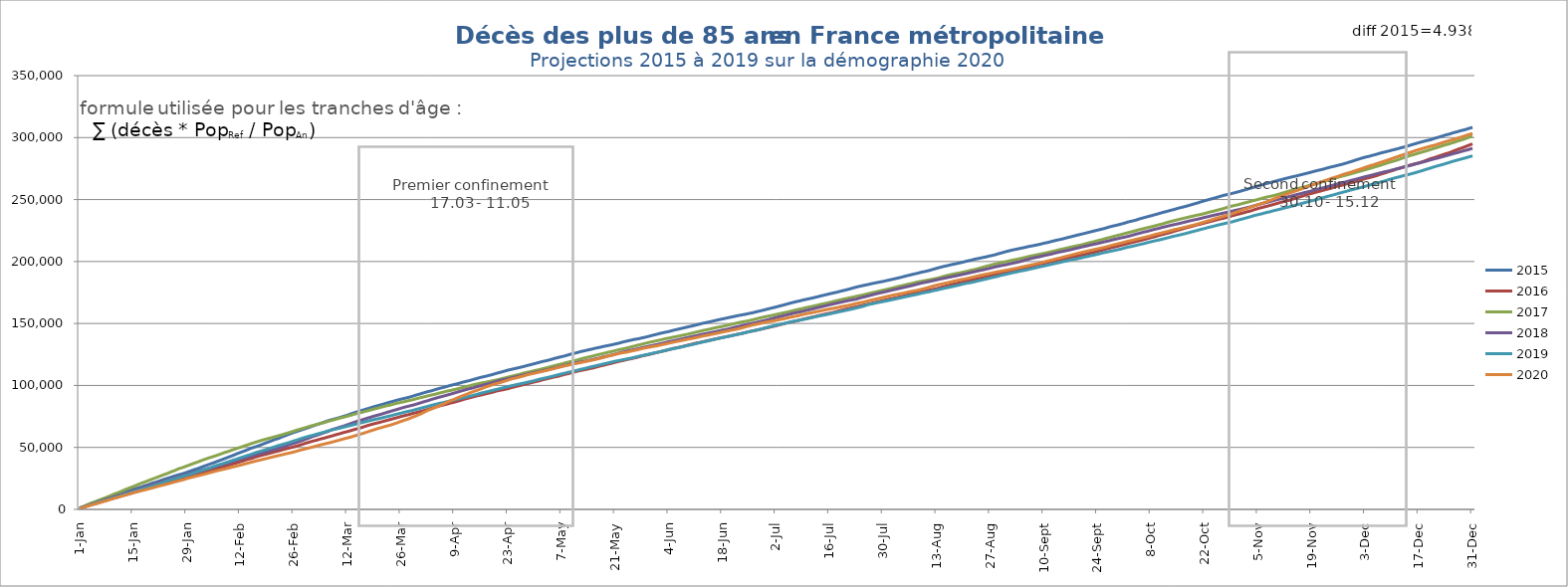
| Category | 2015 | 2016 | 2017 | 2018 | 2019 | 2020 |
|---|---|---|---|---|---|---|
| 2021-01-01 | 1002 | 965 | 1224 | 1048 | 890 | 849 |
| 2021-01-02 | 1899 | 1851 | 2394 | 1962 | 1838 | 1591 |
| 2021-01-03 | 3113 | 2844 | 3743 | 2912 | 2767 | 2603 |
| 2021-01-04 | 4269 | 3743 | 5067 | 3973 | 3746 | 3519 |
| 2021-01-05 | 5322 | 4517 | 6142 | 4996 | 4707 | 4286 |
| 2021-01-06 | 6073 | 5397 | 7405 | 6106 | 5683 | 5136 |
| 2021-01-07 | 7222 | 6390 | 8526 | 7141 | 6641 | 6212 |
| 2021-01-08 | 8402 | 7294 | 9686 | 8321 | 7670 | 7034 |
| 2021-01-09 | 9370 | 8201 | 10924 | 9208 | 8559 | 8070 |
| 2021-01-10 | 10559 | 9103 | 12335 | 10106 | 9480 | 8967 |
| 2021-01-11 | 11648 | 9971 | 13406 | 11138 | 10251 | 9740 |
| 2021-01-12 | 12802 | 10944 | 14687 | 12062 | 11454 | 10680 |
| 2021-01-13 | 13999 | 11868 | 16066 | 13105 | 12411 | 11549 |
| 2021-01-14 | 15185 | 12590 | 17241 | 14133 | 13339 | 12439 |
| 2021-01-15 | 16182 | 13504 | 18389 | 15092 | 14265 | 13373 |
| 2021-01-16 | 17082 | 14327 | 19683 | 16084 | 15225 | 14223 |
| 2021-01-17 | 17948 | 15369 | 20966 | 17078 | 16167 | 14981 |
| 2021-01-18 | 19030 | 16241 | 22040 | 18123 | 17090 | 15723 |
| 2021-01-19 | 19984 | 17296 | 23263 | 19224 | 18090 | 16532 |
| 2021-01-20 | 21166 | 18204 | 24435 | 20231 | 18948 | 17302 |
| 2021-01-21 | 22003 | 19092 | 25610 | 21212 | 19977 | 18175 |
| 2021-01-22 | 23093 | 19808 | 26796 | 22165 | 20862 | 19026 |
| 2021-01-23 | 24162 | 20660 | 27994 | 23002 | 22056 | 19792 |
| 2021-01-24 | 25133 | 21499 | 29073 | 23772 | 23160 | 20568 |
| 2021-01-25 | 26090 | 22455 | 30377 | 24684 | 23998 | 21410 |
| 2021-01-26 | 27133 | 23147 | 31522 | 25636 | 24922 | 22265 |
| 2021-01-27 | 28009 | 23848 | 32953 | 26551 | 25825 | 23108 |
| 2021-01-28 | 28869 | 24608 | 33825 | 27391 | 26743 | 23845 |
| 2021-01-29 | 29902 | 25662 | 35010 | 28263 | 27579 | 24864 |
| 2021-01-30 | 30985 | 26572 | 36158 | 29159 | 28529 | 25631 |
| 2021-01-31 | 32116 | 27528 | 37297 | 30061 | 29486 | 26453 |
| 2021-02-01 | 33040 | 28407 | 38370 | 30873 | 30574 | 27186 |
| 2021-02-02 | 34274 | 29356 | 39592 | 31637 | 31449 | 27970 |
| 2021-02-03 | 35372 | 30272 | 40713 | 32468 | 32411 | 28737 |
| 2021-02-04 | 36485 | 31154 | 41722 | 33332 | 33298 | 29594 |
| 2021-02-05 | 37547 | 32089 | 42715 | 34105 | 34580 | 30394 |
| 2021-02-06 | 38757 | 33018 | 43716 | 34992 | 35657 | 31243 |
| 2021-02-07 | 39905 | 34010 | 44867 | 35956 | 36529 | 31959 |
| 2021-02-08 | 41046 | 34845 | 45973 | 36827 | 37581 | 32638 |
| 2021-02-09 | 42283 | 35794 | 46891 | 37707 | 38546 | 33368 |
| 2021-02-10 | 43404 | 36658 | 48070 | 38756 | 39600 | 34230 |
| 2021-02-11 | 44762 | 37553 | 49079 | 39674 | 40590 | 34943 |
| 2021-02-12 | 45933 | 38453 | 50052 | 40545 | 41614 | 35715 |
| 2021-02-13 | 47064 | 39395 | 51105 | 41448 | 42624 | 36530 |
| 2021-02-14 | 48273 | 40436 | 52141 | 42328 | 43632 | 37370 |
| 2021-02-15 | 49558 | 41161 | 53251 | 43175 | 44640 | 38212 |
| 2021-02-16 | 50500 | 42227 | 54188 | 44111 | 45768 | 38959 |
| 2021-02-17 | 51536 | 43187 | 55197 | 44932 | 46670 | 39715 |
| 2021-02-18 | 52816 | 43986 | 56107 | 45659 | 47571 | 40470 |
| 2021-02-19 | 54000 | 44747 | 56937 | 46652 | 48626 | 41207 |
| 2021-02-20 | 55141 | 45548 | 57720 | 47533 | 49599 | 42006 |
| 2021-02-21 | 56370 | 46434 | 58594 | 48422 | 50497 | 42732 |
| 2021-02-22 | 57271 | 47148 | 59438 | 49319 | 51549 | 43461 |
| 2021-02-23 | 58617 | 48072 | 60318 | 50331 | 52382 | 44153 |
| 2021-02-24 | 59792 | 48938 | 61275 | 51254 | 53260 | 44952 |
| 2021-02-25 | 61022 | 49687 | 62202 | 52408 | 54202 | 45569 |
| 2021-02-26 | 62131 | 50467 | 63169 | 53320 | 55265 | 46325 |
| 2021-02-27 | 63097 | 51331 | 64193 | 54306 | 56186 | 47259 |
| 2021-02-28 | 64169 | 52306 | 65054 | 55353 | 57264 | 48105 |
| 2021-03-01 | 65164 | 53320 | 65942 | 56541 | 58228 | 48827 |
| 2021-03-02 | 66217 | 54283 | 66904 | 57698 | 59091 | 49681 |
| 2021-03-03 | 67354 | 55147 | 67788 | 58898 | 59861 | 50394 |
| 2021-03-04 | 68443 | 55893 | 68538 | 59816 | 60767 | 51241 |
| 2021-03-05 | 69392 | 56856 | 69393 | 60913 | 61579 | 52099 |
| 2021-03-06 | 70532 | 57572 | 70128 | 62010 | 62445 | 52828 |
| 2021-03-07 | 71627 | 58491 | 71124 | 62982 | 63414 | 53546 |
| 2021-03-08 | 72464 | 59314 | 71895 | 64416 | 64186 | 54296 |
| 2021-03-09 | 73280 | 60268 | 72799 | 65332 | 64856 | 55187 |
| 2021-03-10 | 74167 | 61095 | 73686 | 66309 | 65585 | 55972 |
| 2021-03-11 | 75106 | 62031 | 74433 | 67208 | 66361 | 56886 |
| 2021-03-12 | 76022 | 62793 | 75222 | 68334 | 67143 | 57668 |
| 2021-03-13 | 77208 | 63676 | 76102 | 69417 | 67886 | 58489 |
| 2021-03-14 | 78215 | 64636 | 76965 | 70543 | 68610 | 59456 |
| 2021-03-15 | 79139 | 65397 | 77746 | 71496 | 69451 | 60365 |
| 2021-03-16 | 80091 | 66316 | 78548 | 72414 | 70203 | 61259 |
| 2021-03-17 | 81029 | 67408 | 79349 | 73423 | 70969 | 62266 |
| 2021-03-18 | 81960 | 68318 | 80154 | 74298 | 71755 | 63302 |
| 2021-03-19 | 82920 | 69139 | 80993 | 75295 | 72478 | 64307 |
| 2021-03-20 | 83774 | 69895 | 81757 | 76139 | 73152 | 65301 |
| 2021-03-21 | 84590 | 70723 | 82631 | 76966 | 73826 | 66145 |
| 2021-03-22 | 85561 | 71554 | 83444 | 77974 | 74627 | 67028 |
| 2021-03-23 | 86449 | 72372 | 84092 | 78887 | 75310 | 67835 |
| 2021-03-24 | 87284 | 73213 | 84885 | 79801 | 76129 | 68839 |
| 2021-03-25 | 88154 | 74071 | 85732 | 80703 | 76950 | 69868 |
| 2021-03-26 | 88958 | 74964 | 86349 | 81636 | 77685 | 71022 |
| 2021-03-27 | 89657 | 75731 | 87018 | 82542 | 78506 | 72051 |
| 2021-03-28 | 90389 | 76448 | 87769 | 83314 | 79202 | 73104 |
| 2021-03-29 | 91326 | 77383 | 88450 | 84027 | 79848 | 74379 |
| 2021-03-30 | 92296 | 78114 | 89282 | 84929 | 80726 | 75556 |
| 2021-03-31 | 93172 | 79002 | 90089 | 85884 | 81524 | 76856 |
| 2021-04-01 | 94126 | 79741 | 90784 | 86868 | 82348 | 78372 |
| 2021-04-02 | 95009 | 80645 | 91603 | 87735 | 83155 | 79926 |
| 2021-04-03 | 95715 | 81632 | 92313 | 88791 | 84022 | 81081 |
| 2021-04-04 | 96697 | 82524 | 92976 | 89659 | 84782 | 82302 |
| 2021-04-05 | 97601 | 83404 | 93845 | 90550 | 85549 | 83610 |
| 2021-04-06 | 98366 | 84199 | 94592 | 91358 | 86191 | 84942 |
| 2021-04-07 | 99235 | 84949 | 95403 | 92204 | 86911 | 86384 |
| 2021-04-08 | 100108 | 85892 | 95990 | 93059 | 87685 | 87758 |
| 2021-04-09 | 100812 | 86562 | 96737 | 93964 | 88371 | 88943 |
| 2021-04-10 | 101579 | 87436 | 97452 | 94880 | 89179 | 90310 |
| 2021-04-11 | 102534 | 88351 | 98243 | 95780 | 89908 | 91585 |
| 2021-04-12 | 103272 | 89344 | 98983 | 96688 | 90621 | 92678 |
| 2021-04-13 | 104042 | 90088 | 99751 | 97440 | 91305 | 93970 |
| 2021-04-14 | 104932 | 90897 | 100669 | 98206 | 92108 | 95146 |
| 2021-04-15 | 105819 | 91747 | 101300 | 99185 | 92974 | 96206 |
| 2021-04-16 | 106646 | 92362 | 101986 | 99902 | 93886 | 97351 |
| 2021-04-17 | 107311 | 93153 | 102535 | 100730 | 94596 | 98681 |
| 2021-04-18 | 108089 | 93884 | 103124 | 101483 | 95338 | 99615 |
| 2021-04-19 | 108917 | 94574 | 103812 | 102310 | 96088 | 100667 |
| 2021-04-20 | 109872 | 95534 | 104478 | 103305 | 96839 | 101602 |
| 2021-04-21 | 110630 | 96156 | 105195 | 104119 | 97598 | 102363 |
| 2021-04-22 | 111514 | 96762 | 105993 | 104816 | 98361 | 103379 |
| 2021-04-23 | 112391 | 97473 | 106758 | 105453 | 99071 | 104355 |
| 2021-04-24 | 113097 | 98384 | 107548 | 106241 | 99850 | 105366 |
| 2021-04-25 | 113797 | 99128 | 108265 | 106880 | 100561 | 106013 |
| 2021-04-26 | 114501 | 99909 | 108945 | 107575 | 101219 | 106807 |
| 2021-04-27 | 115235 | 100616 | 109918 | 108364 | 101861 | 107639 |
| 2021-04-28 | 116095 | 101412 | 110625 | 109105 | 102565 | 108593 |
| 2021-04-29 | 116853 | 102197 | 111310 | 109894 | 103247 | 109356 |
| 2021-04-30 | 117671 | 102934 | 112088 | 110605 | 104003 | 109966 |
| 2021-05-01 | 118518 | 103635 | 112682 | 111221 | 104882 | 110724 |
| 2021-05-02 | 119330 | 104564 | 113467 | 111839 | 105585 | 111362 |
| 2021-05-03 | 119977 | 105315 | 114208 | 112500 | 106239 | 112113 |
| 2021-05-04 | 120780 | 106034 | 115103 | 113247 | 106978 | 112852 |
| 2021-05-05 | 121715 | 106821 | 115854 | 113949 | 107740 | 113624 |
| 2021-05-06 | 122502 | 107372 | 116680 | 114774 | 108582 | 114467 |
| 2021-05-07 | 123260 | 108272 | 117359 | 115490 | 109322 | 115243 |
| 2021-05-08 | 123991 | 109060 | 118300 | 116233 | 110066 | 115916 |
| 2021-05-09 | 124971 | 109759 | 119000 | 116994 | 110799 | 116597 |
| 2021-05-10 | 125736 | 110710 | 119794 | 117768 | 111551 | 117330 |
| 2021-05-11 | 126468 | 111409 | 120494 | 118379 | 112230 | 117862 |
| 2021-05-12 | 127359 | 112117 | 121390 | 119030 | 113038 | 118500 |
| 2021-05-13 | 128023 | 112718 | 122194 | 119606 | 113706 | 119160 |
| 2021-05-14 | 128750 | 113357 | 122931 | 120161 | 114458 | 119854 |
| 2021-05-15 | 129418 | 113980 | 123617 | 120851 | 115246 | 120445 |
| 2021-05-16 | 130184 | 114794 | 124454 | 121581 | 115926 | 121174 |
| 2021-05-17 | 130784 | 115696 | 125155 | 122222 | 116657 | 121876 |
| 2021-05-18 | 131538 | 116349 | 125911 | 123131 | 117393 | 122698 |
| 2021-05-19 | 132152 | 117172 | 126676 | 123754 | 118096 | 123567 |
| 2021-05-20 | 132760 | 117866 | 127322 | 124520 | 118839 | 124303 |
| 2021-05-21 | 133473 | 118735 | 128130 | 125304 | 119548 | 125026 |
| 2021-05-22 | 134177 | 119455 | 128886 | 126155 | 120166 | 125885 |
| 2021-05-23 | 135055 | 120109 | 129504 | 126979 | 120769 | 126430 |
| 2021-05-24 | 135781 | 120872 | 130211 | 127708 | 121391 | 126873 |
| 2021-05-25 | 136499 | 121501 | 130991 | 128356 | 121977 | 127633 |
| 2021-05-26 | 137147 | 122184 | 131754 | 128998 | 122681 | 128275 |
| 2021-05-27 | 137664 | 122943 | 132576 | 129692 | 123429 | 128910 |
| 2021-05-28 | 138363 | 123802 | 133325 | 130426 | 124132 | 129759 |
| 2021-05-29 | 139044 | 124437 | 134093 | 131106 | 124797 | 130386 |
| 2021-05-30 | 139858 | 125166 | 134880 | 131804 | 125366 | 130932 |
| 2021-05-31 | 140648 | 125911 | 135519 | 132433 | 126130 | 131509 |
| 2021-06-01 | 141437 | 126644 | 136187 | 133090 | 126737 | 132039 |
| 2021-06-02 | 142231 | 127372 | 136872 | 133812 | 127508 | 132756 |
| 2021-06-03 | 142883 | 128078 | 137643 | 134520 | 128247 | 133430 |
| 2021-06-04 | 143520 | 128838 | 138203 | 135338 | 129023 | 134155 |
| 2021-06-05 | 144369 | 129797 | 138859 | 135919 | 129528 | 134799 |
| 2021-06-06 | 145126 | 130363 | 139454 | 136540 | 130224 | 135433 |
| 2021-06-07 | 145797 | 131018 | 140125 | 137244 | 130809 | 136042 |
| 2021-06-08 | 146542 | 131763 | 140744 | 137970 | 131527 | 136707 |
| 2021-06-09 | 147254 | 132560 | 141390 | 138599 | 132283 | 137364 |
| 2021-06-10 | 147948 | 133292 | 142172 | 139379 | 132954 | 137889 |
| 2021-06-11 | 148711 | 134096 | 142957 | 140019 | 133672 | 138506 |
| 2021-06-12 | 149496 | 134669 | 143638 | 140727 | 134398 | 139227 |
| 2021-06-13 | 150271 | 135345 | 144410 | 141420 | 135144 | 139927 |
| 2021-06-14 | 150895 | 136067 | 145004 | 142020 | 135751 | 140465 |
| 2021-06-15 | 151555 | 136734 | 145707 | 142652 | 136499 | 141097 |
| 2021-06-16 | 152303 | 137415 | 146433 | 143291 | 137247 | 141736 |
| 2021-06-17 | 153029 | 138059 | 147075 | 143934 | 137963 | 142328 |
| 2021-06-18 | 153651 | 138682 | 147628 | 144629 | 138611 | 143131 |
| 2021-06-19 | 154331 | 139354 | 148336 | 145186 | 139246 | 143707 |
| 2021-06-20 | 155008 | 139914 | 149054 | 145924 | 139933 | 144336 |
| 2021-06-21 | 155625 | 140651 | 149801 | 146763 | 140544 | 144992 |
| 2021-06-22 | 156324 | 141332 | 150560 | 147507 | 141222 | 145608 |
| 2021-06-23 | 156880 | 141916 | 151178 | 148138 | 141878 | 146388 |
| 2021-06-24 | 157432 | 142719 | 151721 | 148850 | 142630 | 147179 |
| 2021-06-25 | 158131 | 143488 | 152313 | 149552 | 143363 | 148035 |
| 2021-06-26 | 158738 | 144049 | 153047 | 150196 | 144013 | 148836 |
| 2021-06-27 | 159553 | 144681 | 153857 | 150911 | 144753 | 149489 |
| 2021-06-28 | 160240 | 145337 | 154605 | 151680 | 145442 | 150142 |
| 2021-06-29 | 161002 | 146154 | 155317 | 152372 | 146244 | 150824 |
| 2021-06-30 | 161815 | 146774 | 155940 | 153106 | 147089 | 151434 |
| 2021-07-01 | 162545 | 147492 | 156548 | 153971 | 147775 | 152004 |
| 2021-07-02 | 163315 | 148177 | 157273 | 154809 | 148512 | 152521 |
| 2021-07-03 | 164124 | 149052 | 157908 | 155543 | 149319 | 153163 |
| 2021-07-04 | 164920 | 149711 | 158628 | 156344 | 149934 | 153766 |
| 2021-07-05 | 165812 | 150580 | 159217 | 157061 | 150602 | 154467 |
| 2021-07-06 | 166615 | 151229 | 159985 | 157857 | 151420 | 155159 |
| 2021-07-07 | 167418 | 151861 | 160744 | 158600 | 152048 | 155765 |
| 2021-07-08 | 168092 | 152594 | 161483 | 159197 | 152568 | 156451 |
| 2021-07-09 | 168871 | 153375 | 162122 | 159846 | 153215 | 157237 |
| 2021-07-10 | 169579 | 154125 | 162900 | 160612 | 153813 | 157915 |
| 2021-07-11 | 170207 | 154809 | 163535 | 161332 | 154451 | 158486 |
| 2021-07-12 | 170914 | 155487 | 164161 | 162091 | 155191 | 159124 |
| 2021-07-13 | 171679 | 156248 | 164892 | 162883 | 155886 | 159768 |
| 2021-07-14 | 172474 | 156971 | 165662 | 163572 | 156483 | 160418 |
| 2021-07-15 | 173172 | 157656 | 166281 | 164318 | 157058 | 161051 |
| 2021-07-16 | 173966 | 158249 | 166931 | 165098 | 157720 | 161701 |
| 2021-07-17 | 174625 | 158926 | 167752 | 165811 | 158419 | 162238 |
| 2021-07-18 | 175336 | 159796 | 168529 | 166498 | 159124 | 162814 |
| 2021-07-19 | 176155 | 160568 | 169222 | 167182 | 159762 | 163475 |
| 2021-07-20 | 176863 | 161369 | 169917 | 167892 | 160413 | 164095 |
| 2021-07-21 | 177660 | 162046 | 170541 | 168551 | 161085 | 164628 |
| 2021-07-22 | 178549 | 162723 | 171221 | 169114 | 161785 | 165383 |
| 2021-07-23 | 179399 | 163423 | 171886 | 169677 | 162509 | 166162 |
| 2021-07-24 | 180109 | 164139 | 172538 | 170622 | 163242 | 166792 |
| 2021-07-25 | 180785 | 164917 | 173234 | 171413 | 164105 | 167357 |
| 2021-07-26 | 181396 | 165559 | 174003 | 172176 | 165181 | 168209 |
| 2021-07-27 | 182154 | 166291 | 174720 | 173010 | 165769 | 168916 |
| 2021-07-28 | 182779 | 167036 | 175393 | 173824 | 166472 | 169618 |
| 2021-07-29 | 183402 | 167750 | 176159 | 174535 | 167105 | 170343 |
| 2021-07-30 | 183948 | 168510 | 176849 | 175221 | 167713 | 171052 |
| 2021-07-31 | 184693 | 169184 | 177567 | 175945 | 168328 | 171777 |
| 2021-08-01 | 185354 | 169943 | 178289 | 176718 | 168980 | 172472 |
| 2021-08-02 | 186058 | 170483 | 179071 | 177419 | 169667 | 173147 |
| 2021-08-03 | 186781 | 171271 | 179870 | 178110 | 170294 | 173758 |
| 2021-08-04 | 187536 | 171984 | 180553 | 178844 | 171006 | 174279 |
| 2021-08-05 | 188364 | 172801 | 181334 | 179525 | 171681 | 174955 |
| 2021-08-06 | 189115 | 173543 | 181976 | 180236 | 172369 | 175686 |
| 2021-08-07 | 189850 | 174235 | 182693 | 180983 | 172990 | 176235 |
| 2021-08-08 | 190567 | 174881 | 183497 | 181809 | 173602 | 176856 |
| 2021-08-09 | 191386 | 175484 | 184080 | 182613 | 174423 | 177603 |
| 2021-08-10 | 191988 | 176212 | 184629 | 183194 | 175037 | 178343 |
| 2021-08-11 | 192764 | 176830 | 185197 | 183847 | 175568 | 179261 |
| 2021-08-12 | 193631 | 177517 | 185816 | 184532 | 176370 | 180147 |
| 2021-08-13 | 194559 | 178161 | 186458 | 185209 | 176984 | 180999 |
| 2021-08-14 | 195404 | 178997 | 187235 | 185925 | 177738 | 181649 |
| 2021-08-15 | 196176 | 179838 | 188142 | 186576 | 178435 | 182360 |
| 2021-08-16 | 196838 | 180626 | 188957 | 187188 | 179051 | 182984 |
| 2021-08-17 | 197611 | 181505 | 189658 | 187827 | 179713 | 183750 |
| 2021-08-18 | 198197 | 182215 | 190260 | 188456 | 180440 | 184485 |
| 2021-08-19 | 198887 | 182946 | 190810 | 189087 | 181133 | 185101 |
| 2021-08-20 | 199632 | 183641 | 191507 | 189816 | 181983 | 185735 |
| 2021-08-21 | 200460 | 184315 | 192180 | 190472 | 182626 | 186345 |
| 2021-08-22 | 201066 | 185029 | 192974 | 191189 | 183071 | 187064 |
| 2021-08-23 | 201932 | 185691 | 193596 | 191879 | 183775 | 187816 |
| 2021-08-24 | 202534 | 186339 | 194470 | 192584 | 184545 | 188542 |
| 2021-08-25 | 203201 | 187037 | 195339 | 193237 | 185248 | 189248 |
| 2021-08-26 | 203826 | 187754 | 196199 | 193919 | 185927 | 189843 |
| 2021-08-27 | 204591 | 188535 | 196999 | 194654 | 186731 | 190445 |
| 2021-08-28 | 205224 | 189269 | 197811 | 195482 | 187412 | 191142 |
| 2021-08-29 | 206183 | 189881 | 198453 | 196163 | 188111 | 191770 |
| 2021-08-30 | 207035 | 190653 | 199261 | 196819 | 188978 | 192299 |
| 2021-08-31 | 207916 | 191399 | 199857 | 197360 | 189635 | 192937 |
| 2021-09-01 | 208713 | 192203 | 200574 | 198080 | 190353 | 193472 |
| 2021-09-02 | 209442 | 192919 | 201230 | 198732 | 191070 | 194060 |
| 2021-09-03 | 210071 | 193547 | 201800 | 199400 | 191677 | 194709 |
| 2021-09-04 | 210735 | 194203 | 202538 | 200195 | 192414 | 195429 |
| 2021-09-05 | 211326 | 194870 | 203241 | 201101 | 192923 | 196100 |
| 2021-09-06 | 212138 | 195673 | 204042 | 201910 | 193652 | 196747 |
| 2021-09-07 | 212654 | 196400 | 204670 | 202725 | 194323 | 197469 |
| 2021-09-08 | 213287 | 197203 | 205317 | 203354 | 195047 | 198120 |
| 2021-09-09 | 213930 | 197978 | 205919 | 203986 | 195758 | 198877 |
| 2021-09-10 | 214767 | 198526 | 206582 | 204769 | 196396 | 199641 |
| 2021-09-11 | 215363 | 199295 | 207256 | 205415 | 197096 | 200456 |
| 2021-09-12 | 216175 | 199973 | 208005 | 206073 | 197790 | 201163 |
| 2021-09-13 | 216977 | 200594 | 208700 | 206929 | 198511 | 201998 |
| 2021-09-14 | 217619 | 201333 | 209514 | 207619 | 199188 | 202695 |
| 2021-09-15 | 218326 | 201991 | 210211 | 208212 | 199900 | 203524 |
| 2021-09-16 | 219189 | 202639 | 210882 | 208845 | 200568 | 204321 |
| 2021-09-17 | 219931 | 203266 | 211598 | 209556 | 201311 | 205061 |
| 2021-09-18 | 220730 | 203843 | 212286 | 210325 | 201825 | 205886 |
| 2021-09-19 | 221489 | 204507 | 212896 | 211019 | 202394 | 206682 |
| 2021-09-20 | 222226 | 205254 | 213568 | 211812 | 203139 | 207440 |
| 2021-09-21 | 223020 | 205891 | 214445 | 212474 | 203875 | 208114 |
| 2021-09-22 | 223780 | 206750 | 215287 | 213202 | 204527 | 208848 |
| 2021-09-23 | 224580 | 207385 | 215957 | 213882 | 205192 | 209580 |
| 2021-09-24 | 225322 | 208200 | 216834 | 214521 | 205859 | 210203 |
| 2021-09-25 | 226052 | 208976 | 217554 | 215275 | 206693 | 210925 |
| 2021-09-26 | 226855 | 209932 | 218460 | 216027 | 207391 | 211609 |
| 2021-09-27 | 227821 | 210655 | 219254 | 216714 | 208034 | 212421 |
| 2021-09-28 | 228600 | 211456 | 220036 | 217544 | 208649 | 213319 |
| 2021-09-29 | 229289 | 212140 | 220906 | 218255 | 209340 | 214058 |
| 2021-09-30 | 230078 | 212955 | 221617 | 218964 | 210000 | 214773 |
| 2021-10-01 | 230916 | 213749 | 222479 | 219605 | 210865 | 215622 |
| 2021-10-02 | 231931 | 214557 | 223283 | 220331 | 211650 | 216417 |
| 2021-10-03 | 232612 | 215307 | 224066 | 221128 | 212241 | 217039 |
| 2021-10-04 | 233380 | 216097 | 224901 | 222063 | 212982 | 217875 |
| 2021-10-05 | 234447 | 216839 | 225768 | 222832 | 213733 | 218591 |
| 2021-10-06 | 235251 | 217604 | 226469 | 223692 | 214401 | 219297 |
| 2021-10-07 | 236119 | 218445 | 227293 | 224346 | 215232 | 220020 |
| 2021-10-08 | 236917 | 219331 | 227979 | 225216 | 215981 | 220861 |
| 2021-10-09 | 237791 | 220036 | 228817 | 226076 | 216719 | 221766 |
| 2021-10-10 | 238621 | 220996 | 229615 | 226715 | 217319 | 222534 |
| 2021-10-11 | 239578 | 221791 | 230353 | 227600 | 218086 | 223247 |
| 2021-10-12 | 240341 | 222624 | 231354 | 228317 | 218894 | 224029 |
| 2021-10-13 | 241223 | 223399 | 232193 | 229091 | 219672 | 224836 |
| 2021-10-14 | 241982 | 224394 | 232988 | 229774 | 220469 | 225696 |
| 2021-10-15 | 242937 | 225247 | 233754 | 230422 | 221105 | 226311 |
| 2021-10-16 | 243702 | 226081 | 234524 | 231157 | 221843 | 227026 |
| 2021-10-17 | 244461 | 227053 | 235243 | 231958 | 222578 | 227828 |
| 2021-10-18 | 245354 | 227819 | 235970 | 232718 | 223434 | 228569 |
| 2021-10-19 | 246254 | 228658 | 236664 | 233424 | 224211 | 229301 |
| 2021-10-20 | 247131 | 229553 | 237375 | 234034 | 225009 | 230153 |
| 2021-10-21 | 248131 | 230261 | 238003 | 234790 | 225931 | 231032 |
| 2021-10-22 | 249037 | 231083 | 238753 | 235607 | 226644 | 231960 |
| 2021-10-23 | 249923 | 231878 | 239681 | 236282 | 227536 | 232914 |
| 2021-10-24 | 250707 | 232686 | 240362 | 237045 | 228222 | 233792 |
| 2021-10-25 | 251576 | 233499 | 241200 | 237778 | 229048 | 234848 |
| 2021-10-26 | 252518 | 234332 | 241967 | 238433 | 229795 | 235659 |
| 2021-10-27 | 253410 | 234960 | 242819 | 239140 | 230491 | 236566 |
| 2021-10-28 | 254073 | 235770 | 243819 | 239826 | 231218 | 237471 |
| 2021-10-29 | 254839 | 236720 | 244676 | 240546 | 231851 | 238445 |
| 2021-10-30 | 255606 | 237579 | 245318 | 241308 | 232774 | 239441 |
| 2021-10-31 | 256423 | 238401 | 246039 | 241935 | 233645 | 240618 |
| 2021-11-01 | 257348 | 239140 | 246947 | 242641 | 234455 | 241751 |
| 2021-11-02 | 258229 | 240093 | 247705 | 243402 | 235302 | 242768 |
| 2021-11-03 | 259170 | 240775 | 248568 | 244140 | 236151 | 243754 |
| 2021-11-04 | 260055 | 241854 | 249300 | 245052 | 237142 | 244767 |
| 2021-11-05 | 260970 | 242800 | 250152 | 245897 | 237839 | 245922 |
| 2021-11-06 | 261866 | 243616 | 250979 | 246758 | 238579 | 246919 |
| 2021-11-07 | 262763 | 244385 | 251839 | 247458 | 239441 | 247959 |
| 2021-11-08 | 263541 | 245184 | 252503 | 248282 | 240096 | 249131 |
| 2021-11-09 | 264478 | 246036 | 253178 | 249196 | 240990 | 250410 |
| 2021-11-10 | 265252 | 246969 | 253989 | 250057 | 241716 | 251645 |
| 2021-11-11 | 266056 | 247826 | 254920 | 250740 | 242492 | 252828 |
| 2021-11-12 | 266882 | 248608 | 255827 | 251494 | 243320 | 253981 |
| 2021-11-13 | 267664 | 249317 | 256767 | 252357 | 244016 | 255043 |
| 2021-11-14 | 268387 | 250370 | 257761 | 253114 | 244799 | 256093 |
| 2021-11-15 | 269077 | 251287 | 258577 | 253968 | 245706 | 257169 |
| 2021-11-16 | 269878 | 252272 | 259370 | 254714 | 246501 | 258274 |
| 2021-11-17 | 270634 | 253197 | 260101 | 255525 | 247387 | 259310 |
| 2021-11-18 | 271418 | 254282 | 261079 | 256256 | 248217 | 260513 |
| 2021-11-19 | 272217 | 254978 | 262002 | 257018 | 248996 | 261564 |
| 2021-11-20 | 273073 | 255875 | 262806 | 257905 | 249831 | 262645 |
| 2021-11-21 | 273804 | 256635 | 263598 | 258749 | 250655 | 263738 |
| 2021-11-22 | 274522 | 257505 | 264612 | 259498 | 251529 | 264798 |
| 2021-11-23 | 275449 | 258323 | 265398 | 260332 | 252410 | 265823 |
| 2021-11-24 | 276257 | 259105 | 266279 | 261162 | 253239 | 266981 |
| 2021-11-25 | 276945 | 260164 | 267098 | 261948 | 254050 | 267908 |
| 2021-11-26 | 277739 | 260963 | 268121 | 262915 | 254980 | 268915 |
| 2021-11-27 | 278513 | 261591 | 268965 | 263687 | 255792 | 270065 |
| 2021-11-28 | 279395 | 262564 | 269722 | 264323 | 256639 | 271004 |
| 2021-11-29 | 280391 | 263362 | 270578 | 265240 | 257504 | 271879 |
| 2021-11-30 | 281349 | 264158 | 271439 | 266008 | 258317 | 272877 |
| 2021-12-01 | 282379 | 265099 | 272354 | 266788 | 259102 | 273876 |
| 2021-12-02 | 283357 | 265973 | 273164 | 267629 | 259840 | 274880 |
| 2021-12-03 | 284222 | 266932 | 274136 | 268466 | 260729 | 275988 |
| 2021-12-04 | 284910 | 267670 | 274919 | 269199 | 261633 | 277063 |
| 2021-12-05 | 285788 | 268469 | 275883 | 269976 | 262521 | 277917 |
| 2021-12-06 | 286599 | 269351 | 276795 | 270786 | 263275 | 278956 |
| 2021-12-07 | 287554 | 270439 | 277708 | 271548 | 264174 | 280003 |
| 2021-12-08 | 288303 | 271369 | 278732 | 272362 | 264959 | 280973 |
| 2021-12-09 | 289062 | 272378 | 279785 | 272992 | 265957 | 281966 |
| 2021-12-10 | 289881 | 273283 | 280672 | 273814 | 266835 | 283120 |
| 2021-12-11 | 290625 | 274440 | 281582 | 274583 | 267663 | 284206 |
| 2021-12-12 | 291478 | 275286 | 282635 | 275346 | 268410 | 285258 |
| 2021-12-13 | 292300 | 276150 | 283729 | 276251 | 269333 | 286251 |
| 2021-12-14 | 293142 | 277020 | 284786 | 277011 | 269947 | 287349 |
| 2021-12-15 | 294115 | 278052 | 285772 | 277711 | 270788 | 288317 |
| 2021-12-16 | 294990 | 278853 | 286642 | 278586 | 271620 | 289401 |
| 2021-12-17 | 295926 | 279593 | 287564 | 279426 | 272540 | 290345 |
| 2021-12-18 | 296750 | 280572 | 288457 | 280207 | 273474 | 291226 |
| 2021-12-19 | 297543 | 281736 | 289313 | 281055 | 274477 | 292146 |
| 2021-12-20 | 298173 | 282969 | 290359 | 281989 | 275386 | 293047 |
| 2021-12-21 | 299285 | 283775 | 291276 | 282801 | 276387 | 293723 |
| 2021-12-22 | 300167 | 284870 | 292191 | 283557 | 277313 | 294808 |
| 2021-12-23 | 301109 | 285863 | 293278 | 284401 | 278091 | 295745 |
| 2021-12-24 | 302114 | 286957 | 294200 | 285268 | 279040 | 296732 |
| 2021-12-25 | 302852 | 287827 | 295028 | 286120 | 279981 | 297616 |
| 2021-12-26 | 303897 | 289059 | 296034 | 287053 | 280954 | 298470 |
| 2021-12-27 | 304683 | 290339 | 297026 | 287791 | 281786 | 299387 |
| 2021-12-28 | 305629 | 291359 | 297991 | 288698 | 282619 | 300351 |
| 2021-12-29 | 306310 | 292504 | 299020 | 289549 | 283446 | 301377 |
| 2021-12-30 | 307327 | 293737 | 300103 | 290350 | 284384 | 302400 |
| 2021-12-31 | 308233 | 294910 | 301131 | 291356 | 285242 | 303295 |